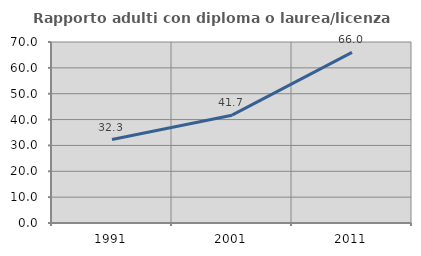
| Category | Rapporto adulti con diploma o laurea/licenza media  |
|---|---|
| 1991.0 | 32.292 |
| 2001.0 | 41.69 |
| 2011.0 | 65.957 |